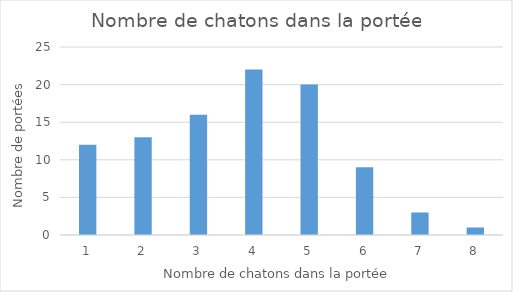
| Category | Series 0 |
|---|---|
| 1.0 | 12 |
| 2.0 | 13 |
| 3.0 | 16 |
| 4.0 | 22 |
| 5.0 | 20 |
| 6.0 | 9 |
| 7.0 | 3 |
| 8.0 | 1 |